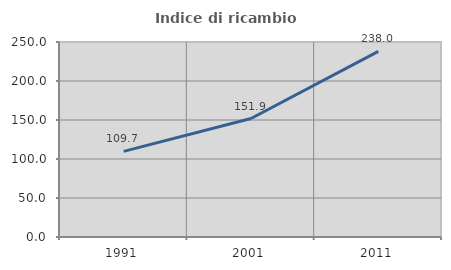
| Category | Indice di ricambio occupazionale  |
|---|---|
| 1991.0 | 109.733 |
| 2001.0 | 151.88 |
| 2011.0 | 238 |